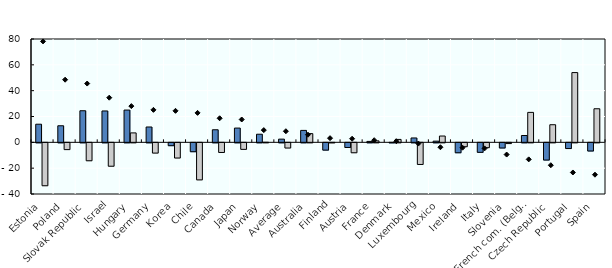
| Category | Change in teachers' salary | change in estimated class size |
|---|---|---|
| Estonia | 14.024 | -33.218 |
| Poland | 12.829 | -5.237 |
| Slovak Republic | 24.452 | -13.878 |
| Israel | 24.288 | -18.11 |
| Hungary | 24.993 | 7.299 |
| Germany | 11.872 | -7.936 |
| Korea | -2.208 | -11.764 |
| Chile | -6.874 | -28.689 |
| Canada | 9.733 | -7.467 |
| Japan | 11.043 | -5.054 |
| Norway | 6.279 | 0.053 |
| Average | 2.482 | -4.019 |
| Australia | 9.237 | 6.759 |
| Finland | -5.636 | -0.07 |
| Austria | -3.606 | -7.684 |
| France | 0.714 | 1.136 |
| Denmark | -0.049 | 2.262 |
| Luxembourg | 3.379 | -16.75 |
| Mexico | 0.918 | 4.888 |
| Ireland | -7.689 | -2.987 |
| Italy | -7.357 | -3.744 |
| Slovenia | -3.994 | -0.575 |
| French com. (Belgium) | 5.279 | 23.183 |
| Czech Republic | -13.331 | 13.634 |
| Portugal | -4.415 | 54.011 |
| Spain | -6.329 | 25.994 |